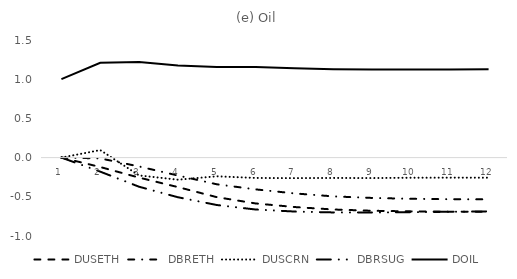
| Category | DUSETH | DBRETH | DUSCRN | DBRSUG | DOIL |
|---|---|---|---|---|---|
| 0 | 0 | 0 | 0 | 0 | 1 |
| 1 | -0.12 | -0.01 | 0.096 | -0.179 | 1.208 |
| 2 | -0.255 | -0.113 | -0.227 | -0.372 | 1.218 |
| 3 | -0.376 | -0.229 | -0.282 | -0.506 | 1.174 |
| 4 | -0.504 | -0.34 | -0.238 | -0.605 | 1.155 |
| 5 | -0.585 | -0.405 | -0.26 | -0.662 | 1.154 |
| 6 | -0.63 | -0.457 | -0.262 | -0.688 | 1.139 |
| 7 | -0.662 | -0.494 | -0.26 | -0.699 | 1.126 |
| 8 | -0.678 | -0.515 | -0.261 | -0.7 | 1.123 |
| 9 | -0.686 | -0.526 | -0.257 | -0.696 | 1.123 |
| 10 | -0.689 | -0.531 | -0.256 | -0.691 | 1.124 |
| 11 | -0.69 | -0.532 | -0.256 | -0.686 | 1.126 |